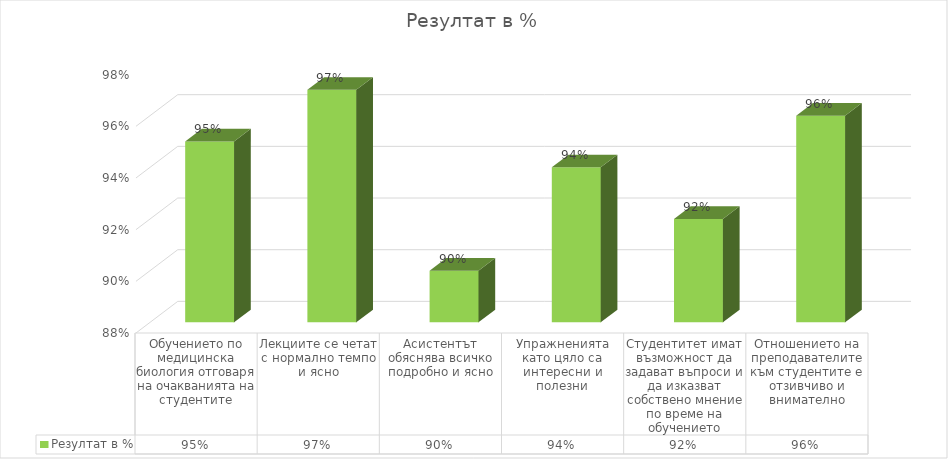
| Category | Резултат в % |
|---|---|
| Обучението по медицинска биология отговаря на очакванията на студентите | 0.95 |
| Лекциите се четат с нормално темпо и ясно | 0.97 |
| Асистентът обяснява всичко подробно и ясно | 0.9 |
| Упражненията като цяло са интересни и полезни | 0.94 |
| Студентитет имат възможност да задават въпроси и да изказват собствено мнение по време на обучението | 0.92 |
| Отношението на преподавателите към студентите е отзивчиво и внимателно | 0.96 |